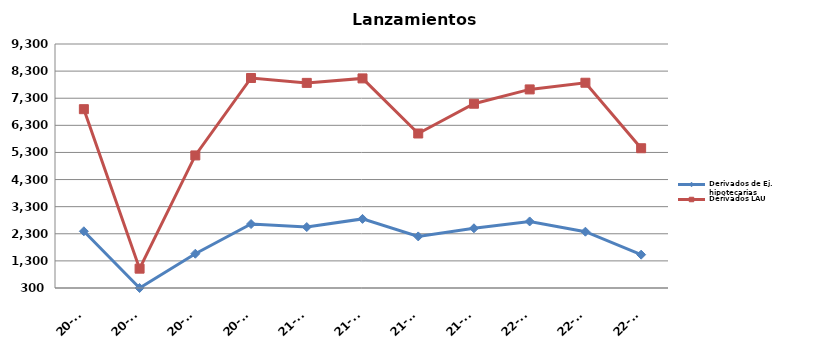
| Category | Derivados de Ej. hipotecarias | Derivados LAU |
|---|---|---|
| 20-T1 | 2392 | 6896 |
| 20-T2 | 300 | 1013 |
| 20-T3 | 1564 | 5190 |
| 20-T4 | 2659 | 8046 |
| 21-T1 | 2548 | 7866 |
| 21-T2 | 2849 | 8031 |
| 21-T3 | 2203 | 5999 |
| 21-T4 | 2503 | 7097 |
| 22-T1 | 2755 | 7625 |
| 22-T2 | 2377 | 7871 |
| 22-T3 | 1530 | 5455 |